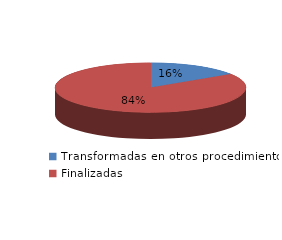
| Category | Series 0 |
|---|---|
| Transformadas en otros procedimientos | 513 |
| Finalizadas | 2742 |